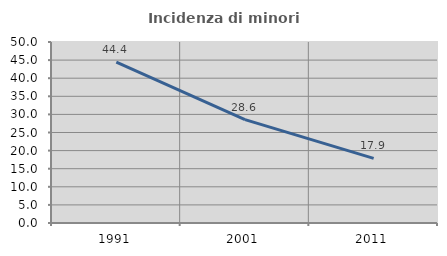
| Category | Incidenza di minori stranieri |
|---|---|
| 1991.0 | 44.444 |
| 2001.0 | 28.571 |
| 2011.0 | 17.857 |